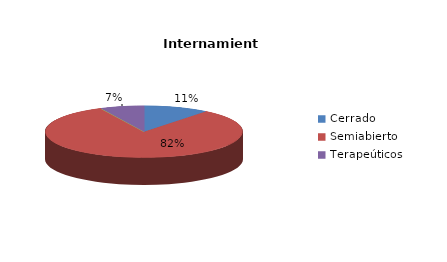
| Category | Series 0 |
|---|---|
| Cerrado | 3 |
| Semiabierto | 23 |
| Abierto | 0 |
| Terapeúticos | 2 |